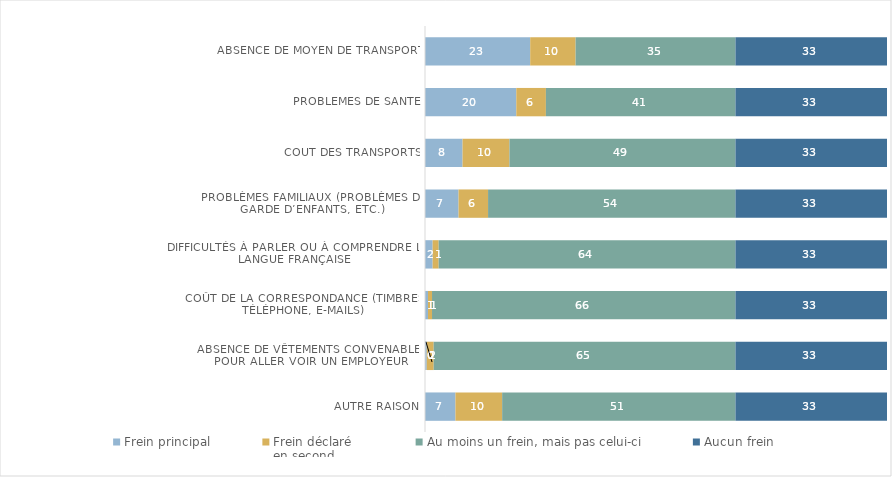
| Category | Frein principal | Frein déclaré 
en second | Au moins un frein, mais pas celui-ci | Aucun frein |
|---|---|---|---|---|
| Absence de moyen de transport | 22.77 | 9.83 | 34.6 | 32.8 |
| Problèmes de santé | 19.76 | 6.41 | 41.03 | 32.8 |
| Coût des transports | 8.13 | 10.15 | 48.92 | 32.8 |
| Problèmes familiaux (problèmes de garde d’enfants, etc.) | 7.26 | 6.39 | 53.55 | 32.8 |
| Difficultés à parler ou à comprendre la langue française | 1.65 | 1.31 | 64.24 | 32.8 |
| Coût de la correspondance (timbres, téléphone, e-mails) | 0.65 | 0.87 | 65.68 | 32.8 |
| Absence de vêtements convenables pour aller voir un employeur | 0.38 | 1.5 | 65.32 | 32.8 |
| Autre raison | 6.59 | 10.11 | 50.5 | 32.8 |